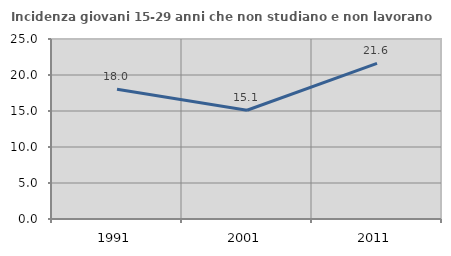
| Category | Incidenza giovani 15-29 anni che non studiano e non lavorano  |
|---|---|
| 1991.0 | 18.009 |
| 2001.0 | 15.106 |
| 2011.0 | 21.61 |